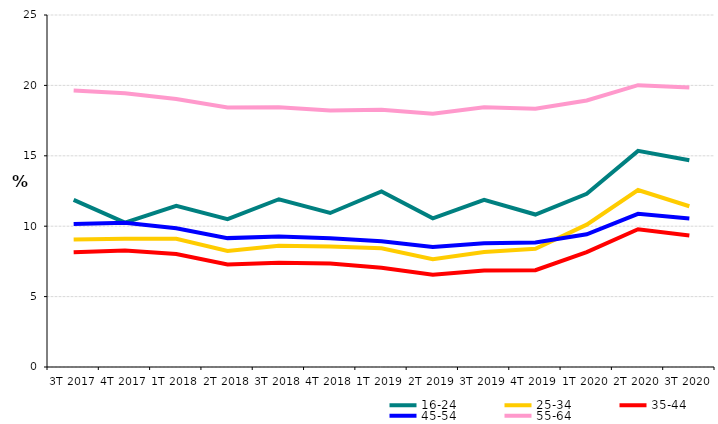
| Category | 16-24 | 25-34 | 35-44 | 45-54 | 55-64 |
|---|---|---|---|---|---|
| 3T 2017 | 11.868 | 9.048 | 8.145 | 10.148 | 19.633 |
| 4T 2017 | 10.252 | 9.103 | 8.278 | 10.241 | 19.448 |
| 1T 2018 | 11.451 | 9.111 | 8.031 | 9.856 | 19.03 |
| 2T 2018 | 10.502 | 8.242 | 7.284 | 9.153 | 18.424 |
| 3T 2018 | 11.915 | 8.613 | 7.399 | 9.266 | 18.447 |
| 4T 2018 | 10.937 | 8.558 | 7.357 | 9.136 | 18.215 |
| 1T 2019 | 12.471 | 8.427 | 7.049 | 8.938 | 18.266 |
| 2T 2019 | 10.559 | 7.659 | 6.546 | 8.523 | 17.984 |
| 3T 2019 | 11.878 | 8.16 | 6.852 | 8.783 | 18.453 |
| 4T 2019 | 10.829 | 8.392 | 6.875 | 8.845 | 18.335 |
| 1T 2020 | 12.3 | 10.111 | 8.158 | 9.423 | 18.932 |
| 2T 2020 | 15.349 | 12.567 | 9.783 | 10.875 | 20.019 |
| 3T 2020 | 14.678 | 11.415 | 9.335 | 10.548 | 19.848 |